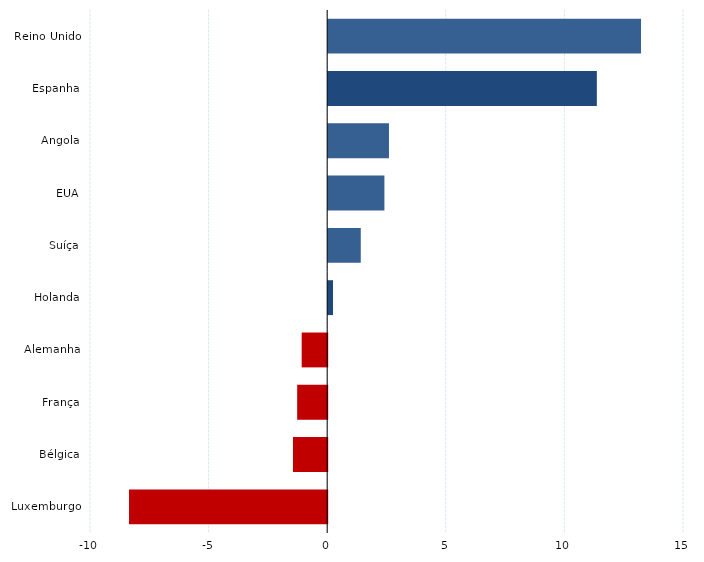
| Category | Series 0 |
|---|---|
| Reino Unido | 13.188 |
| Espanha | 11.326 |
| Angola | 2.562 |
| EUA | 2.37 |
| Suíça | 1.373 |
| Holanda | 0.202 |
| Alemanha | -1.076 |
| França | -1.266 |
| Bélgica | -1.443 |
| Luxemburgo | -8.355 |